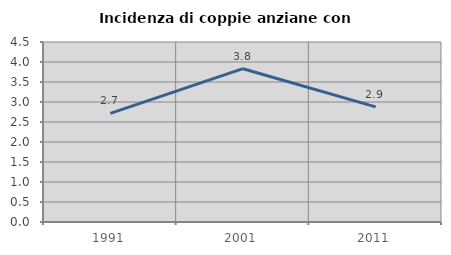
| Category | Incidenza di coppie anziane con figli |
|---|---|
| 1991.0 | 2.717 |
| 2001.0 | 3.833 |
| 2011.0 | 2.878 |